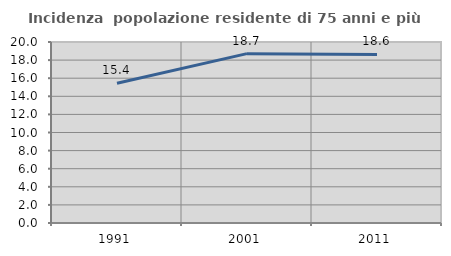
| Category | Incidenza  popolazione residente di 75 anni e più |
|---|---|
| 1991.0 | 15.444 |
| 2001.0 | 18.714 |
| 2011.0 | 18.628 |